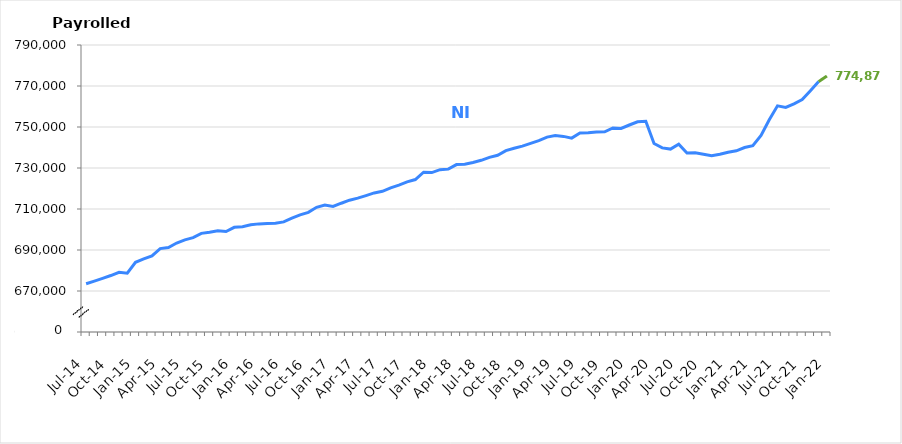
| Category | NI |
|---|---|
| Jul-14 | 673526 |
| Aug-14 | 674796 |
| Sep-14 | 676158 |
| Oct-14 | 677540 |
| Nov-14 | 679151 |
| Dec-14 | 678686 |
| Jan-15 | 684012 |
| Feb-15 | 685635 |
| Mar-15 | 687103 |
| Apr-15 | 690670 |
| May-15 | 691177 |
| Jun-15 | 693416 |
| Jul-15 | 694934 |
| Aug-15 | 696054 |
| Sep-15 | 698116 |
| Oct-15 | 698646 |
| Nov-15 | 699408 |
| Dec-15 | 699002 |
| Jan-16 | 701075 |
| Feb-16 | 701310 |
| Mar-16 | 702279 |
| Apr-16 | 702740 |
| May-16 | 702978 |
| Jun-16 | 703089 |
| Jul-16 | 703699 |
| Aug-16 | 705535 |
| Sep-16 | 707166 |
| Oct-16 | 708365 |
| Nov-16 | 710818 |
| Dec-16 | 711956 |
| Jan-17 | 711234 |
| Feb-17 | 712818 |
| Mar-17 | 714289 |
| Apr-17 | 715306 |
| May-17 | 716556 |
| Jun-17 | 717846 |
| Jul-17 | 718614 |
| Aug-17 | 720295 |
| Sep-17 | 721685 |
| Oct-17 | 723232 |
| Nov-17 | 724361 |
| Dec-17 | 727931 |
| Jan-18 | 727774 |
| Feb-18 | 729185 |
| Mar-18 | 729444 |
| Apr-18 | 731661 |
| May-18 | 731842 |
| Jun-18 | 732684 |
| Jul-18 | 733748 |
| Aug-18 | 735168 |
| Sep-18 | 736217 |
| Oct-18 | 738491 |
| Nov-18 | 739623 |
| Dec-18 | 740656 |
| Jan-19 | 742012 |
| Feb-19 | 743382 |
| Mar-19 | 745058 |
| Apr-19 | 745804 |
| May-19 | 745418 |
| Jun-19 | 744562 |
| Jul-19 | 747046 |
| Aug-19 | 747212 |
| Sep-19 | 747557 |
| Oct-19 | 747650 |
| Nov-19 | 749530 |
| Dec-19 | 749311 |
| Jan-20 | 750971 |
| Feb-20 | 752565 |
| Mar-20 | 752831 |
| Apr-20 | 741965 |
| May-20 | 739794 |
| Jun-20 | 739224 |
| Jul-20 | 741589 |
| Aug-20 | 737338 |
| Sep-20 | 737483 |
| Oct-20 | 736747 |
| Nov-20 | 735982 |
| Dec-20 | 736673 |
| Jan-21 | 737674 |
| Feb-21 | 738389 |
| Mar-21 | 740004 |
| Apr-21 | 740862 |
| May-21 | 745871 |
| Jun-21 | 753489 |
| Jul-21 | 760311 |
| Aug-21 | 759557 |
| Sep-21 | 761320 |
| Oct-21 | 763369 |
| Nov-21 | 767717 |
| Dec-21 | 772140 |
| Jan-22 | 774875 |